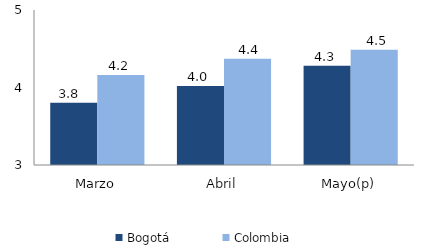
| Category | Bogotá | Colombia |
|---|---|---|
| Marzo | 3.804 | 4.161 |
| Abril | 4.02 | 4.371 |
| Mayo(p) | 4.28 | 4.489 |